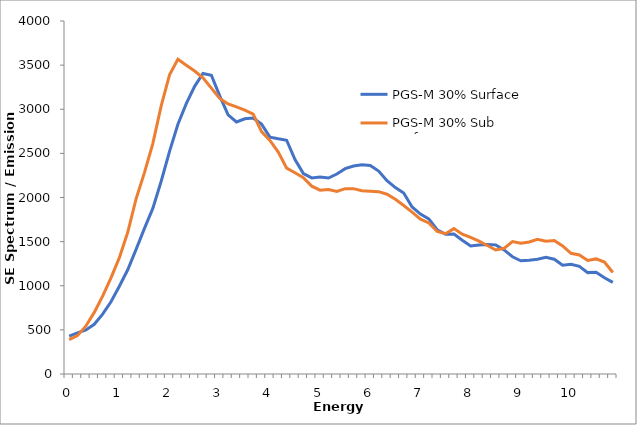
| Category | PGS-M 30% Surface | PGS-M 30% Sub Surface |
|---|---|---|
| 0.0 | 429.771 | 390.668 |
| nan | 465.538 | 434.811 |
| nan | 498.425 | 544.289 |
| nan | 563.386 | 697.994 |
| nan | 678.704 | 882.83 |
| nan | 818.337 | 1088.86 |
| 1.0 | 994.219 | 1317.875 |
| nan | 1181.183 | 1605.212 |
| nan | 1412.475 | 1985.339 |
| nan | 1649.824 | 2282.082 |
| nan | 1876.131 | 2609.748 |
| nan | 2184.122 | 3037.622 |
| 2.0 | 2522.847 | 3390.517 |
| nan | 2830.752 | 3566.043 |
| nan | 3063.534 | 3499.204 |
| nan | 3259.601 | 3433.518 |
| nan | 3405.916 | 3355.032 |
| nan | 3384.644 | 3239.239 |
| 3.0 | 3151.004 | 3122.966 |
| nan | 2937.209 | 3060.792 |
| nan | 2855.797 | 3027.589 |
| nan | 2892.196 | 2990.172 |
| nan | 2900.487 | 2945.844 |
| nan | 2831.224 | 2747.075 |
| 4.0 | 2684.324 | 2647.21 |
| nan | 2664.697 | 2514.001 |
| nan | 2648.807 | 2332.745 |
| nan | 2430.56 | 2280.202 |
| nan | 2270.822 | 2224.811 |
| nan | 2221.995 | 2128.383 |
| 5.0 | 2232.053 | 2083.544 |
| nan | 2220.871 | 2090.439 |
| nan | 2266.516 | 2068.768 |
| nan | 2326.544 | 2099.964 |
| nan | 2356.321 | 2100.136 |
| nan | 2371.048 | 2076.842 |
| 6.0 | 2362.703 | 2072.055 |
| nan | 2299.982 | 2066.443 |
| nan | 2189.625 | 2037.272 |
| nan | 2112.011 | 1979.942 |
| nan | 2051.238 | 1908.665 |
| nan | 1892.307 | 1835.102 |
| 7.0 | 1811.78 | 1754.568 |
| nan | 1758.425 | 1712.422 |
| nan | 1634.988 | 1614.839 |
| nan | 1582.426 | 1589.216 |
| nan | 1585.026 | 1647.302 |
| nan | 1515.683 | 1583.688 |
| 8.0 | 1450.686 | 1547.108 |
| nan | 1461.409 | 1505.173 |
| nan | 1467.861 | 1456.125 |
| nan | 1463.266 | 1405.163 |
| nan | 1405.742 | 1424.005 |
| nan | 1328.442 | 1500.975 |
| 9.0 | 1282.578 | 1481.808 |
| nan | 1289.388 | 1495.924 |
| nan | 1301.048 | 1526.349 |
| nan | 1322.137 | 1505.663 |
| nan | 1300.817 | 1512.14 |
| nan | 1232.769 | 1451.684 |
| 10.0 | 1243.14 | 1367.404 |
| nan | 1220.406 | 1349.525 |
| nan | 1148.939 | 1285.801 |
| nan | 1153.786 | 1304.017 |
| nan | 1090.977 | 1267.784 |
| nan | 1037.968 | 1150.278 |